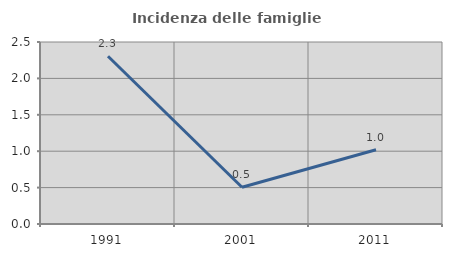
| Category | Incidenza delle famiglie numerose |
|---|---|
| 1991.0 | 2.304 |
| 2001.0 | 0.505 |
| 2011.0 | 1.02 |